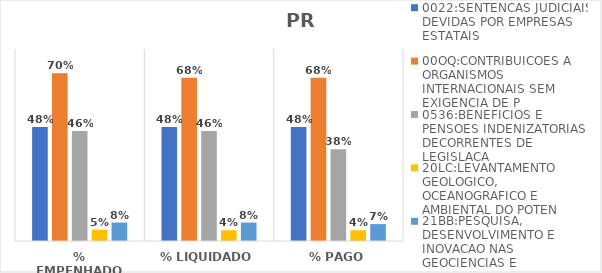
| Category | 0022:SENTENCAS JUDICIAIS DEVIDAS POR EMPRESAS ESTATAIS | 00OQ:CONTRIBUICOES A ORGANISMOS INTERNACIONAIS SEM EXIGENCIA DE P | 0536:BENEFICIOS E PENSOES INDENIZATORIAS DECORRENTES DE LEGISLACA | 20LC:LEVANTAMENTO GEOLOGICO, OCEANOGRAFICO E AMBIENTAL DO POTEN | 21BB:PESQUISA, DESENVOLVIMENTO E INOVACAO NAS GEOCIENCIAS E |
|---|---|---|---|---|---|
| % EMPENHADO | 0.475 | 0.699 | 0.459 | 0.047 | 0.077 |
| % LIQUIDADO | 0.475 | 0.681 | 0.459 | 0.045 | 0.077 |
| % PAGO | 0.475 | 0.681 | 0.383 | 0.045 | 0.07 |